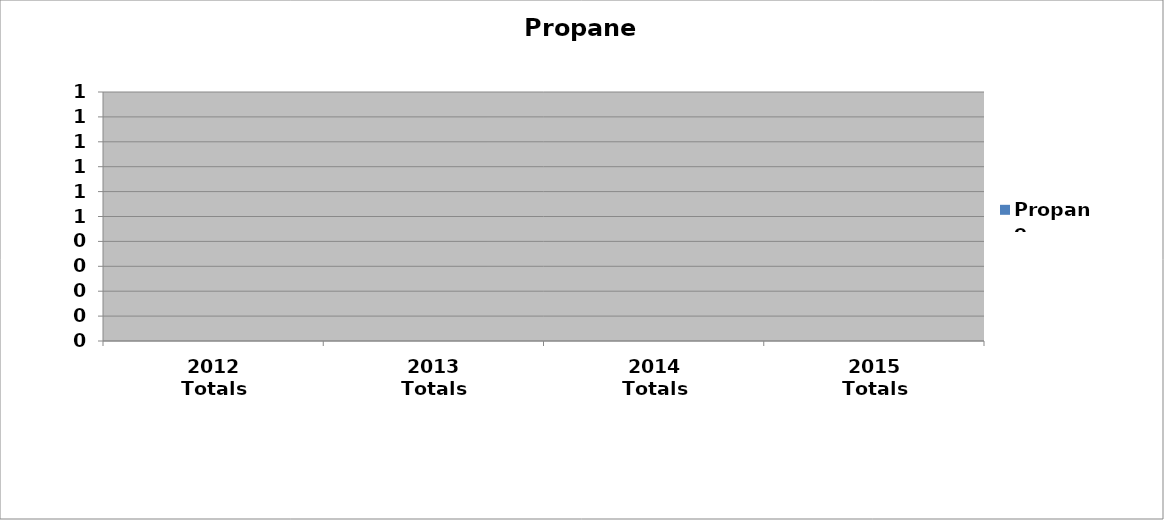
| Category | Propane |
|---|---|
| 2012 Totals | 0 |
| 2013 Totals | 0 |
| 2014 Totals | 0 |
| 2015 Totals | 0 |